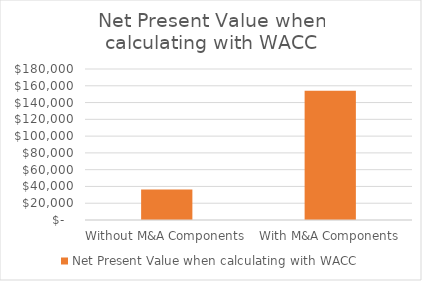
| Category | Net Present Value when calculating with WACC |
|---|---|
| Without M&A Components | 36352.337 |
| With M&A Components | 154142.485 |